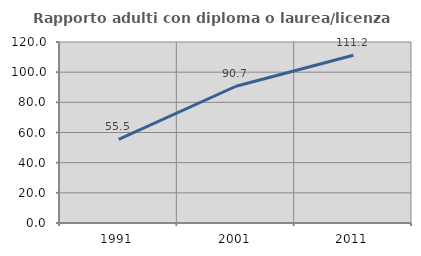
| Category | Rapporto adulti con diploma o laurea/licenza media  |
|---|---|
| 1991.0 | 55.455 |
| 2001.0 | 90.667 |
| 2011.0 | 111.23 |